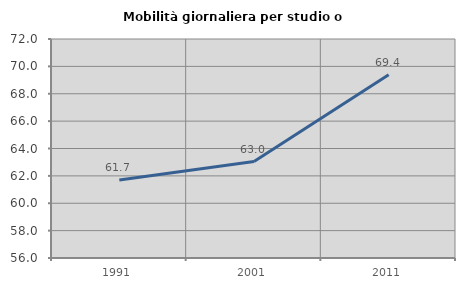
| Category | Mobilità giornaliera per studio o lavoro |
|---|---|
| 1991.0 | 61.698 |
| 2001.0 | 63.045 |
| 2011.0 | 69.39 |